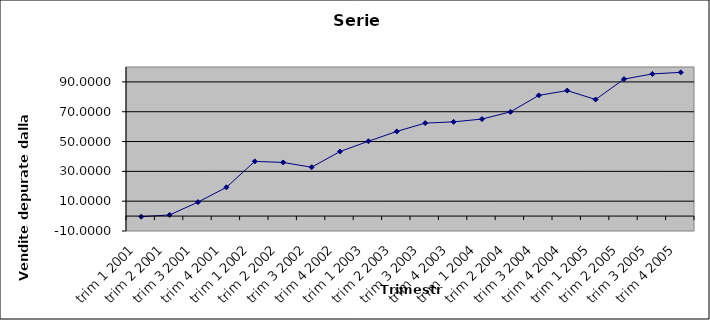
| Category | Serie detrendizzata |
|---|---|
| trim 1 2001 | -0.404 |
| trim 2 2001 | 0.782 |
| trim 3 2001 | 9.369 |
| trim 4 2001 | 19.295 |
| trim 1 2002 | 36.696 |
| trim 2 2002 | 35.983 |
| trim 3 2002 | 32.769 |
| trim 4 2002 | 43.295 |
| trim 1 2003 | 50.196 |
| trim 2 2003 | 56.782 |
| trim 3 2003 | 62.369 |
| trim 4 2003 | 63.195 |
| trim 1 2004 | 65.096 |
| trim 2 2004 | 69.882 |
| trim 3 2004 | 80.969 |
| trim 4 2004 | 84.195 |
| trim 1 2005 | 78.196 |
| trim 2 2005 | 91.882 |
| trim 3 2005 | 95.369 |
| trim 4 2005 | 96.395 |